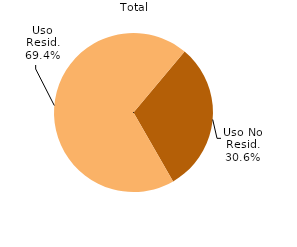
| Category | Series 0 |
|---|---|
| Uso No Resid. | 0.306 |
| Uso Resid. | 0.694 |